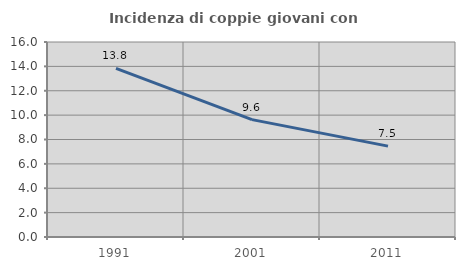
| Category | Incidenza di coppie giovani con figli |
|---|---|
| 1991.0 | 13.831 |
| 2001.0 | 9.63 |
| 2011.0 | 7.458 |